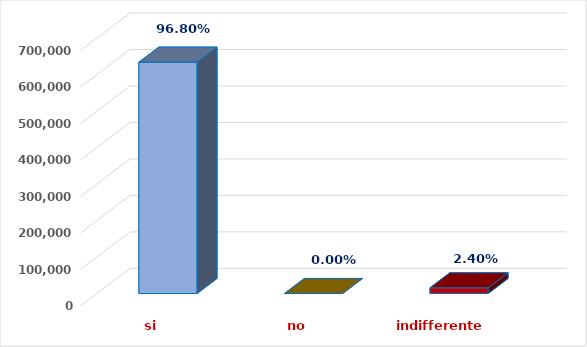
| Category | Series 0 |
|---|---|
| si | 634176.679 |
| no | 0 |
| indifferente | 15723.389 |